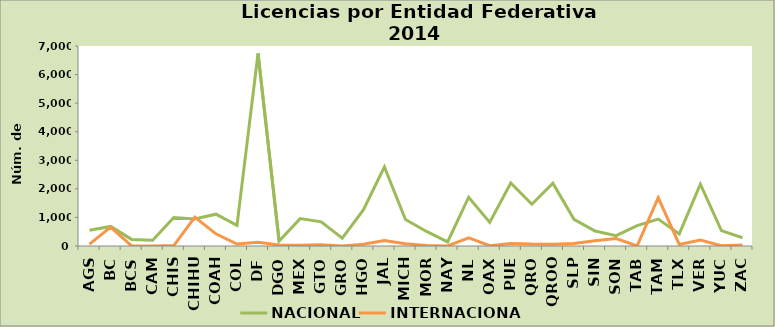
| Category | NACIONAL | INTERNACIONAL |
|---|---|---|
| AGS | 550 | 68 |
| BC | 686 | 659 |
| BCS | 231 | 3 |
| CAM | 201 | 1 |
| CHIS | 996 | 16 |
| CHIHU | 944 | 1014 |
| COAH | 1114 | 427 |
| COL | 721 | 69 |
| DF | 6740 | 129 |
| DGO | 173 | 39 |
| MEX | 959 | 25 |
| GTO | 846 | 45 |
| GRO | 272 | 2 |
| HGO | 1261 | 65 |
| JAL | 2769 | 188 |
| MICH | 929 | 78 |
| MOR | 509 | 15 |
| NAY | 143 | 4 |
| NL | 1707 | 289 |
| OAX | 825 | 9 |
| PUE | 2205 | 87 |
| QRO | 1463 | 66 |
| QROO | 2199 | 63 |
| SLP | 933 | 84 |
| SIN | 523 | 185 |
| SON | 364 | 261 |
| TAB | 713 | 5 |
| TAM | 944 | 1693 |
| TLX | 425 | 54 |
| VER | 2165 | 209 |
| YUC | 537 | 8 |
| ZAC | 288 | 33 |